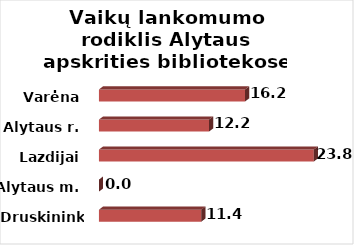
| Category | Series 0 |
|---|---|
| Druskininkai | 11.361 |
| Alytaus m. | 0 |
| Lazdijai | 23.838 |
| Alytaus r. | 12.219 |
| Varėna | 16.211 |